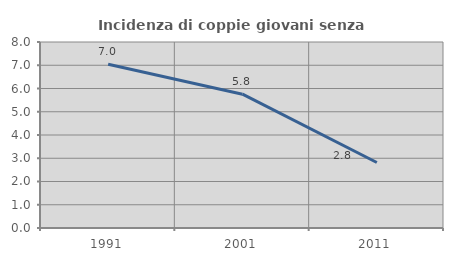
| Category | Incidenza di coppie giovani senza figli |
|---|---|
| 1991.0 | 7.041 |
| 2001.0 | 5.756 |
| 2011.0 | 2.818 |